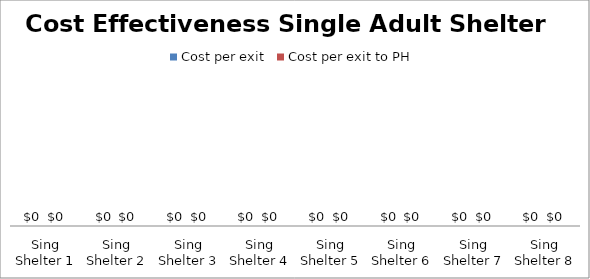
| Category | Cost per exit | Cost per exit to PH |
|---|---|---|
| Sing Shelter 1 | 0 | 0 |
| Sing Shelter 2 | 0 | 0 |
| Sing Shelter 3 | 0 | 0 |
| Sing Shelter 4 | 0 | 0 |
| Sing Shelter 5 | 0 | 0 |
| Sing Shelter 6 | 0 | 0 |
| Sing Shelter 7 | 0 | 0 |
| Sing Shelter 8 | 0 | 0 |